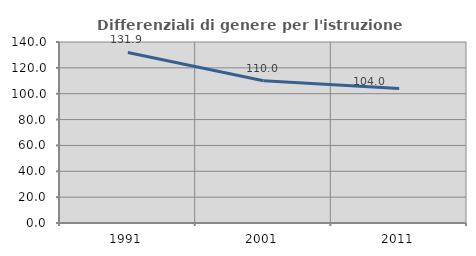
| Category | Differenziali di genere per l'istruzione superiore |
|---|---|
| 1991.0 | 131.935 |
| 2001.0 | 110.021 |
| 2011.0 | 104.02 |